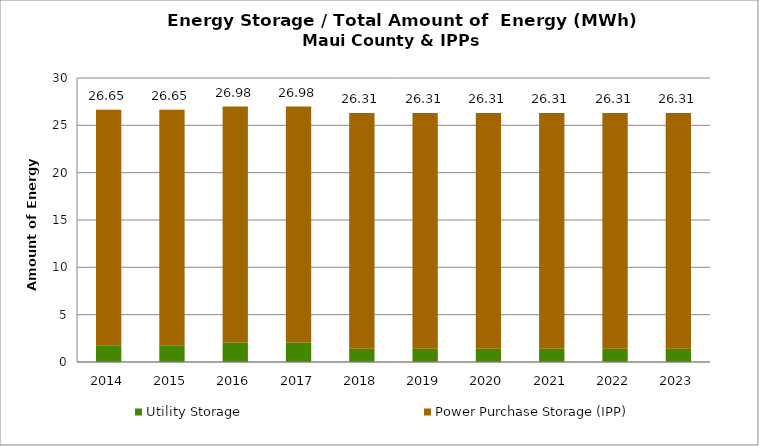
| Category | Utility Storage | Power Purchase Storage (IPP) |
|---|---|---|
| 2014.0 | 1.729 | 24.916 |
| 2015.0 | 1.729 | 24.916 |
| 2016.0 | 2.062 | 24.916 |
| 2017.0 | 2.062 | 24.916 |
| 2018.0 | 1.397 | 24.916 |
| 2019.0 | 1.397 | 24.916 |
| 2020.0 | 1.397 | 24.916 |
| 2021.0 | 1.397 | 24.916 |
| 2022.0 | 1.397 | 24.916 |
| 2023.0 | 1.397 | 24.916 |